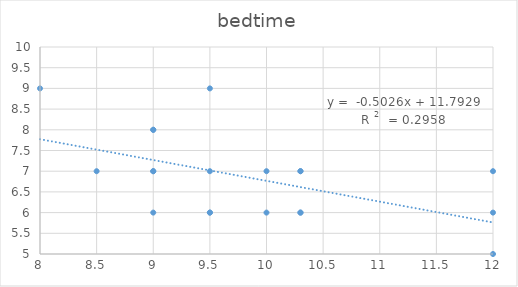
| Category | Series 0 |
|---|---|
| 10.3 | 6 |
| 10.3 | 7 |
| 9.0 | 7 |
| 9.5 | 7 |
| 9.0 | 8 |
| 10.3 | 7 |
| 9.0 | 8 |
| 12.0 | 6 |
| 12.0 | 7 |
| 10.3 | 6 |
| 12.0 | 5 |
| 9.5 | 6 |
| 10.0 | 7 |
| 10.0 | 6 |
| 9.0 | 6 |
| 8.5 | 7 |
| 9.5 | 9 |
| 8.0 | 9 |
| 9.5 | 6 |
| 9.0 | 7 |